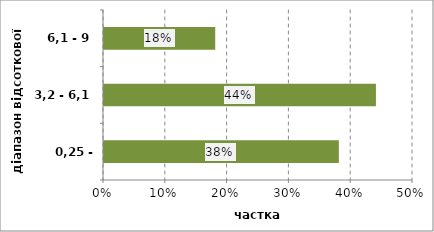
| Category | Series 0 |
|---|---|
| 0,25 - 3,2 | 0.38 |
| 3,2 - 6,1 | 0.44 |
| 6,1 - 9 | 0.18 |